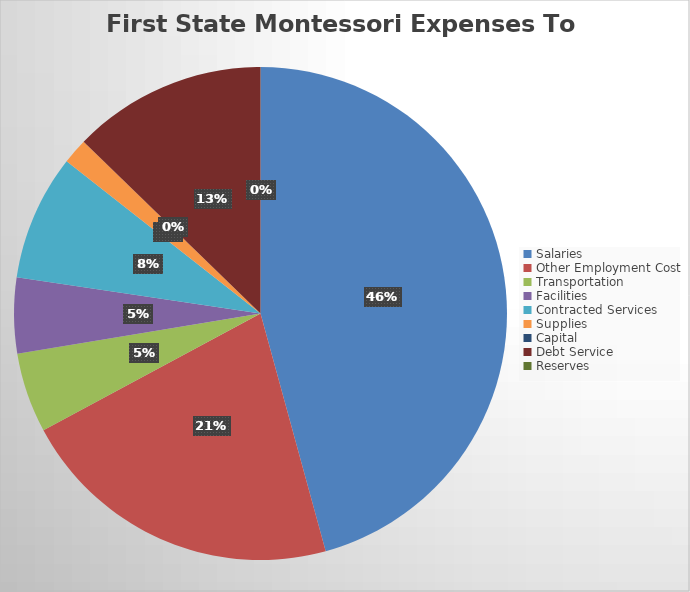
| Category | Series 0 |
|---|---|
| Salaries | 2776950.44 |
| Other Employment Cost | 1299426.27 |
| Transportation | 318994.77 |
| Facilities | 300253.06 |
| Contracted Services | 500978.85 |
| Supplies | 101471.01 |
| Capital | 0 |
| Debt Service | 773103.4 |
| Reserves | 0 |